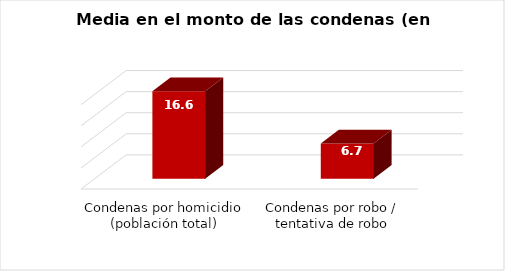
| Category | Series 0 |
|---|---|
| Condenas por homicidio (población total) | 16.6 |
| Condenas por robo / tentativa de robo | 6.7 |